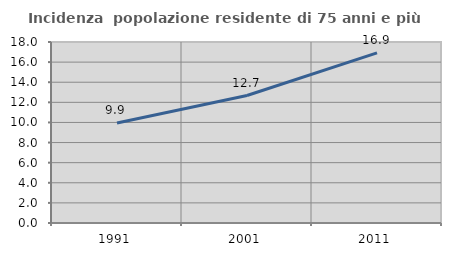
| Category | Incidenza  popolazione residente di 75 anni e più |
|---|---|
| 1991.0 | 9.943 |
| 2001.0 | 12.677 |
| 2011.0 | 16.918 |